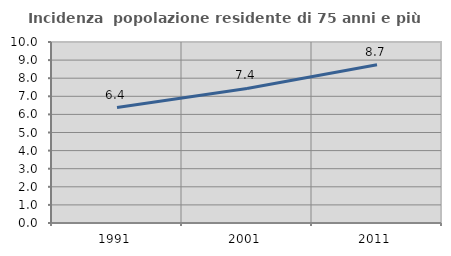
| Category | Incidenza  popolazione residente di 75 anni e più |
|---|---|
| 1991.0 | 6.377 |
| 2001.0 | 7.435 |
| 2011.0 | 8.739 |